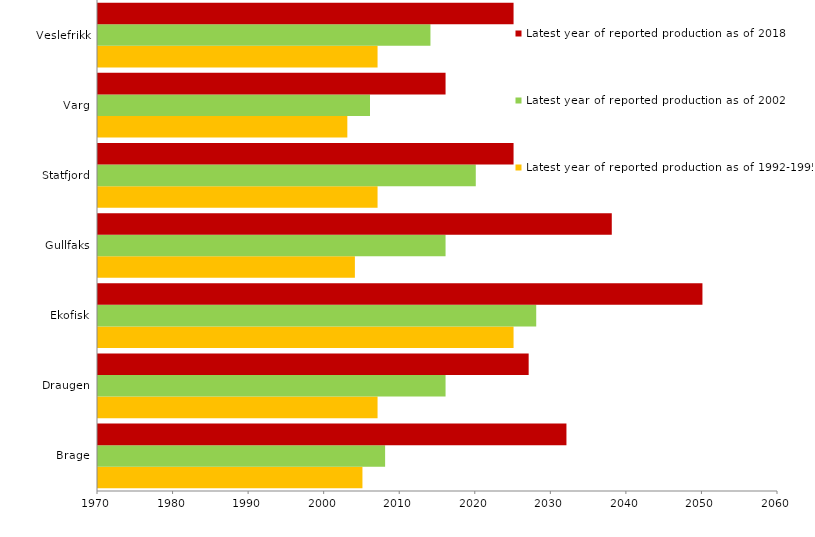
| Category | Latest year of reported production as of 1992-1995 | Latest year of reported production as of 2002 | Latest year of reported production as of 2018 |
|---|---|---|---|
| Brage | 2005 | 2008 | 2032 |
| Draugen | 2007 | 2016 | 2027 |
| Ekofisk | 2025 | 2028 | 2050 |
| Gullfaks | 2004 | 2016 | 2038 |
| Statfjord | 2007 | 2020 | 2025 |
| Varg | 2003 | 2006 | 2016 |
| Veslefrikk | 2007 | 2014 | 2025 |